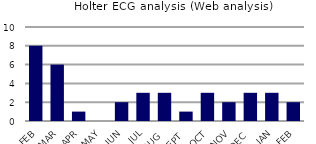
| Category | Holter ECG analysis (Web analysis) |
|---|---|
| FEB | 8 |
| MAR | 6 |
| APR | 1 |
| MAY | 0 |
| JUN | 2 |
| JUL | 3 |
| AUG | 3 |
| SEPT | 1 |
| OCT | 3 |
| NOV | 2 |
| DEC | 3 |
| JAN | 3 |
| FEB | 2 |